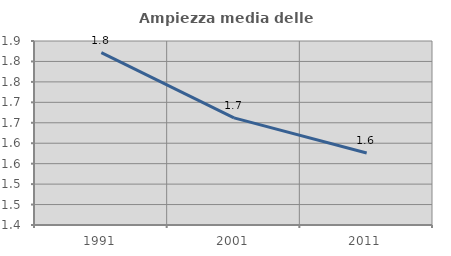
| Category | Ampiezza media delle famiglie |
|---|---|
| 1991.0 | 1.822 |
| 2001.0 | 1.662 |
| 2011.0 | 1.576 |